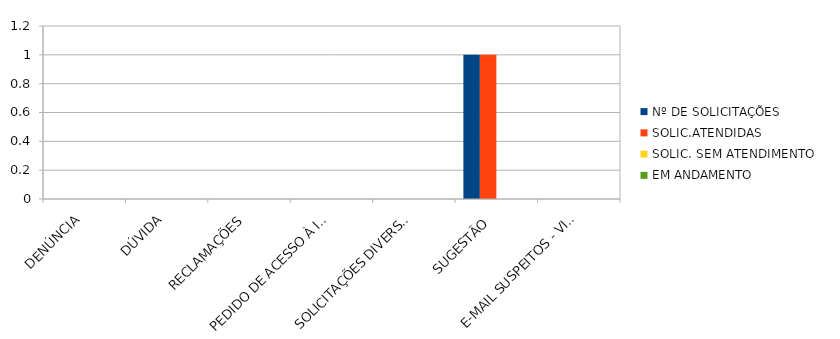
| Category | Nº DE SOLICITAÇÕES | SOLIC.ATENDIDAS | SOLIC. SEM ATENDIMENTO | EM ANDAMENTO |
|---|---|---|---|---|
| DENÚNCIA | 0 | 0 | 0 | 0 |
| DÚVIDA | 0 | 0 | 0 | 0 |
| RECLAMAÇÕES | 0 | 0 | 0 | 0 |
| PEDIDO DE ACESSO À INFORMAÇÃO | 0 | 0 | 0 | 0 |
| SOLICITAÇÕES DIVERSAS | 0 | 0 | 0 | 0 |
| SUGESTÃO  | 1 | 1 | 0 | 0 |
| E-MAIL SUSPEITOS - VIRÚS | 0 | 0 | 0 | 0 |